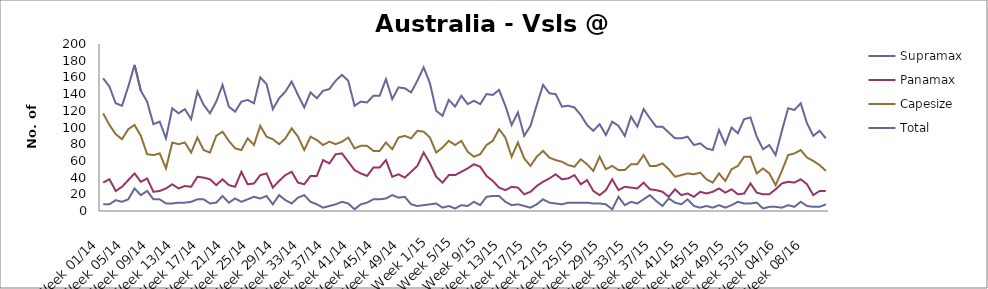
| Category | Supramax | Panamax | Capesize | Total |
|---|---|---|---|---|
| Week 01/14 | 8 | 34 | 117 | 159 |
| Week 02/14 | 8 | 38 | 103 | 149 |
| Week 03/14 | 13 | 24 | 92 | 129 |
| Week 04/14 | 11 | 29 | 86 | 126 |
| Week 05/14 | 14 | 37 | 98 | 149 |
| Week 06/14 | 27 | 45 | 103 | 175 |
| Week 07/14 | 19 | 35 | 90 | 144 |
| Week 08/14 | 24 | 39 | 68 | 131 |
| Week 09/14 | 14 | 23 | 67 | 104 |
| Week 10/14 | 14 | 24 | 69 | 107 |
| Week 11/14 | 9 | 27 | 51 | 87 |
| Week 12/14 | 9 | 32 | 82 | 123 |
| Week 13/14 | 10 | 27 | 80 | 117 |
| Week 14/14 | 10 | 30 | 82 | 122 |
| Week 15/14 | 11 | 29 | 70 | 110 |
| Week 16/14 | 14 | 41 | 88 | 143 |
| Week 17/14 | 14 | 40 | 73 | 127 |
| Week 18/14 | 9 | 38 | 70 | 117 |
| Week 19/14 | 10 | 31 | 90 | 131 |
| Week 20/14 | 18 | 38 | 95 | 151 |
| Week 21/14 | 10 | 31 | 84 | 125 |
| Week 22/14 | 15 | 29 | 75 | 119 |
| Week 23/14 | 11 | 47 | 73 | 131 |
| Week 24/14 | 14 | 32 | 87 | 133 |
| Week 25/14 | 17 | 33 | 79 | 129 |
| Week 26/14 | 15 | 43 | 102 | 160 |
| Week 27/14 | 18 | 45 | 89 | 152 |
| Week 28/14 | 8 | 28 | 86 | 122 |
| Week 29/14 | 19 | 36 | 80 | 135 |
| Week 30/14 | 13 | 43 | 87 | 143 |
| Week 31/14 | 9 | 47 | 99 | 155 |
| Week 32/14 | 16 | 34 | 89 | 139 |
| Week 33/14 | 19 | 32 | 73 | 124 |
| Week 34/14 | 11 | 42 | 89 | 142 |
| Week 35/14 | 8 | 42 | 85 | 135 |
| Week 36/14 | 4 | 61 | 79 | 144 |
| Week 37/14 | 6 | 57 | 83 | 146 |
| Week 38/14 | 8 | 68 | 80 | 156 |
| Week 39/14 | 11 | 69 | 83 | 163 |
| Week 40/14 | 9 | 59 | 88 | 156 |
| Week 41/14 | 2 | 49 | 75 | 126 |
| Week 42/14 | 8 | 45 | 78 | 131 |
| Week 43/14 | 10 | 42 | 78 | 130 |
| Week 44/14 | 14 | 52 | 72 | 138 |
| Week 45/14 | 14 | 52 | 72 | 138 |
| Week 46/14 | 15 | 61 | 82 | 158 |
| Week 47/14 | 19 | 41 | 74 | 134 |
| Week 48/14 | 16 | 44 | 88 | 148 |
| Week 49/14 | 17 | 40 | 90 | 147 |
| Week 50/14 | 8 | 47 | 87 | 142 |
| Week 51/14 | 6 | 54 | 96 | 156 |
| Week 52/14 | 7 | 70 | 95 | 172 |
| Week 1/15 | 8 | 57 | 88 | 153 |
| Week 2/15 | 9 | 41 | 70 | 120 |
| Week 3/15 | 4 | 34 | 76 | 114 |
| Week 4/15 | 6 | 43 | 84 | 133 |
| Week 5/15 | 3 | 43 | 79 | 125 |
| Week 6/15 | 7 | 47 | 84 | 138 |
| Week 7/15 | 6 | 51 | 71 | 128 |
| Week 8/15 | 11 | 56 | 65 | 132 |
| Week 9/15 | 7 | 53 | 68 | 128 |
| Week 10/15 | 17 | 42 | 79 | 140 |
| Week 11/15 | 18 | 36 | 84 | 139 |
| Week 12/15 | 18 | 28 | 98 | 145 |
| Week 13/15 | 11 | 25 | 88 | 126 |
| Week 14/15 | 7 | 29 | 65 | 103 |
| Week 15/15 | 8 | 28 | 82 | 118 |
| Week 16/15 | 6 | 20 | 63 | 90 |
| Week 17/15 | 4 | 23 | 54 | 102 |
| Week 18/15 | 8 | 30 | 65 | 127 |
| Week 19/15 | 14 | 35 | 72 | 151 |
| Week 20/15 | 10 | 39 | 64 | 141 |
| Week 21/15 | 9 | 44 | 61 | 140 |
| Week 22/15 | 8 | 38 | 59 | 125 |
| Week 23/15 | 10 | 39 | 55 | 126 |
| Week 24/15 | 10 | 43 | 53 | 124 |
| Week 25/15 | 10 | 32 | 62 | 115 |
| Week 26/15 | 10 | 37 | 56 | 103 |
| Week 27/15 | 9 | 24 | 48 | 96 |
| Week 28/15 | 9 | 19 | 65 | 104 |
| Week 29/15 | 8 | 25 | 50 | 91 |
| Week 30/15 | 2 | 38 | 54 | 107 |
| Week 31/15 | 17 | 25 | 49 | 102 |
| Week 32/15 | 7 | 29 | 49 | 90 |
| Week 33/15 | 11 | 28 | 56 | 113 |
| Week 34/15 | 9 | 27 | 56 | 101 |
| Week 35/15 | 14 | 34 | 67 | 122 |
| Week 36/15 | 19 | 26 | 54 | 111 |
| Week 37/15 | 12 | 25 | 54 | 101 |
| Week 38/15 | 6 | 23 | 57 | 101 |
| Week 39/15 | 15 | 17 | 50 | 94 |
| Week 40/15 | 10 | 26 | 41 | 87 |
| Week 41/15 | 8 | 19 | 43 | 87 |
| Week 42/15 | 14 | 21 | 45 | 89 |
| Week 43/15 | 6 | 17 | 44 | 79 |
| Week 44/15 | 4 | 23 | 46 | 81 |
| Week 45/15 | 6 | 21 | 38 | 75 |
| Week 46/15 | 4 | 23 | 34 | 73 |
| Week 47/15 | 7 | 27 | 45 | 97 |
| Week 48/15 | 4 | 22 | 36 | 80 |
| Week 49/15 | 7 | 26 | 50 | 100 |
| Week 50/15 | 11 | 20 | 54 | 93 |
| Week 51/15 | 9 | 21 | 65 | 110 |
| Week 52/15 | 9 | 33 | 65 | 112 |
| Week 53/15 | 10 | 22 | 45 | 89 |
| Week 01/16 | 3 | 20 | 51 | 74 |
| Week 02/16 | 5 | 20 | 45 | 79 |
| Week 03/16 | 5 | 26 | 31 | 67 |
| Week 04/16 | 4 | 33 | 48 | 96 |
| Week 05/16 | 7 | 35 | 67 | 123 |
| Week 06/16 | 5 | 34 | 69 | 121 |
| Week 07/16 | 11 | 38 | 73 | 129 |
| Week 08/16 | 6 | 32 | 64 | 105 |
| Week 09/16 | 5 | 19 | 60 | 90 |
| Week 10/16 | 5 | 24 | 55 | 96 |
| Week 11/16 | 8 | 24 | 48 | 87 |